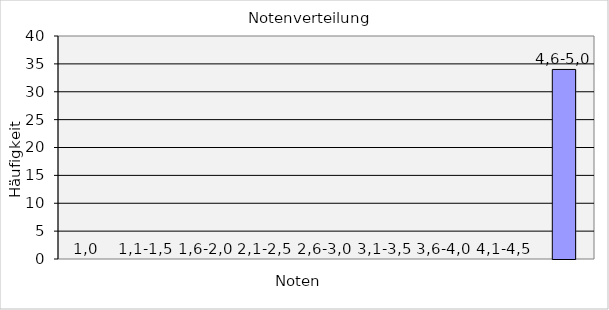
| Category | Series 0 |
|---|---|
| 1,0 | 0 |
| 1,1-1,5 | 0 |
| 1,6-2,0 | 0 |
| 2,1-2,5 | 0 |
| 2,6-3,0 | 0 |
| 3,1-3,5 | 0 |
| 3,6-4,0 | 0 |
| 4,1-4,5 | 0 |
| 4,6-5,0 | 34 |